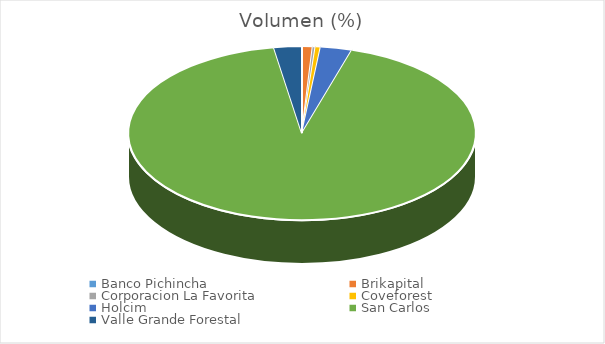
| Category | Volumen |
|---|---|
| Banco Pichincha | 118 |
| Brikapital | 5000 |
| Corporacion La Favorita | 1341.95 |
| Coveforest | 2501.2 |
| Holcim | 15142 |
| San Carlos | 480358 |
| Valle Grande Forestal | 13405.6 |